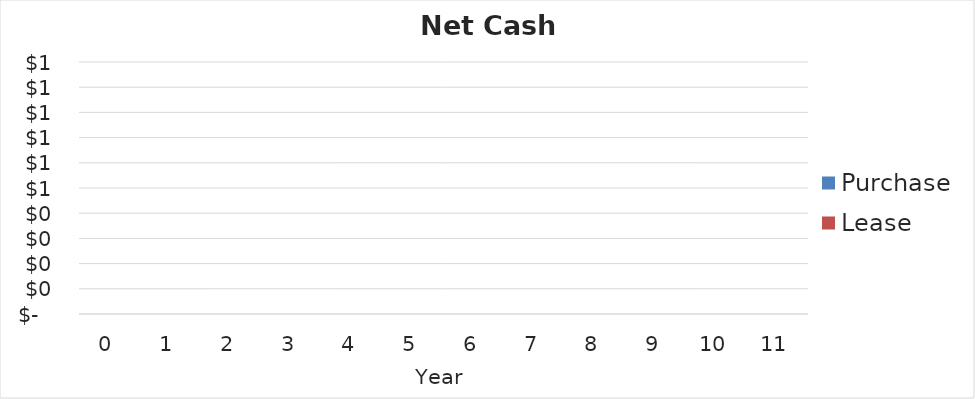
| Category | Purchase | Lease |
|---|---|---|
| 0.0 | 0 | 0 |
| 1.0 | 0 | 0 |
| 2.0 | 0 | 0 |
| 3.0 | 0 | 0 |
| 4.0 | 0 | 0 |
| 5.0 | 0 | 0 |
| 6.0 | 0 | 0 |
| 7.0 | 0 | 0 |
| 8.0 | 0 | 0 |
| 9.0 | 0 | 0 |
| 10.0 | 0 | 0 |
| 11.0 | 0 | 0 |